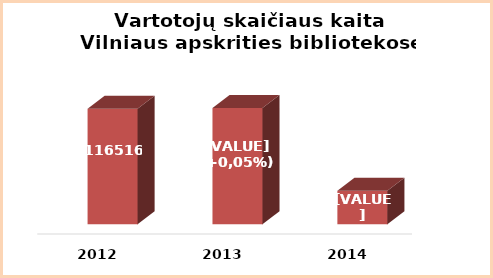
| Category | Series 0 |
|---|---|
| 2012.0 | 116516 |
| 2013.0 | 116577 |
| 2014.0 | 110470 |